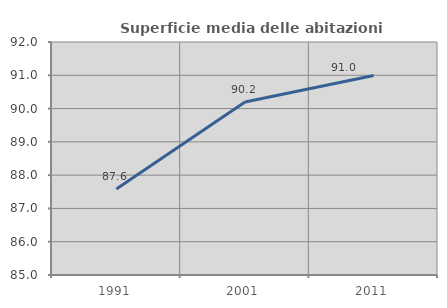
| Category | Superficie media delle abitazioni occupate |
|---|---|
| 1991.0 | 87.58 |
| 2001.0 | 90.197 |
| 2011.0 | 90.996 |